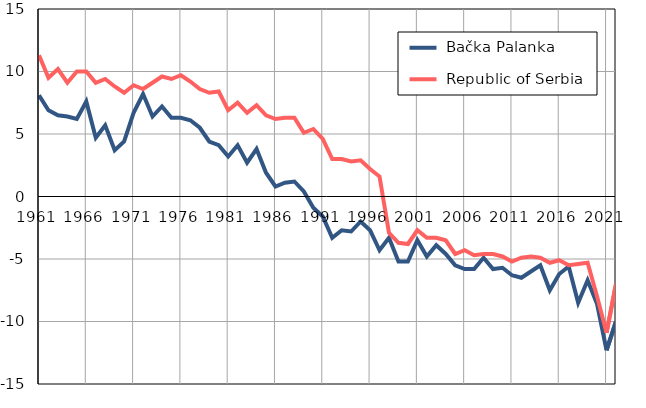
| Category |  Bačka Palanka |  Republic of Serbia |
|---|---|---|
| 1961.0 | 8.1 | 11.3 |
| 1962.0 | 6.9 | 9.5 |
| 1963.0 | 6.5 | 10.2 |
| 1964.0 | 6.4 | 9.1 |
| 1965.0 | 6.2 | 10 |
| 1966.0 | 7.6 | 10 |
| 1967.0 | 4.7 | 9.1 |
| 1968.0 | 5.7 | 9.4 |
| 1969.0 | 3.7 | 8.8 |
| 1970.0 | 4.4 | 8.3 |
| 1971.0 | 6.7 | 8.9 |
| 1972.0 | 8.2 | 8.6 |
| 1973.0 | 6.4 | 9.1 |
| 1974.0 | 7.2 | 9.6 |
| 1975.0 | 6.3 | 9.4 |
| 1976.0 | 6.3 | 9.7 |
| 1977.0 | 6.1 | 9.2 |
| 1978.0 | 5.5 | 8.6 |
| 1979.0 | 4.4 | 8.3 |
| 1980.0 | 4.1 | 8.4 |
| 1981.0 | 3.2 | 6.9 |
| 1982.0 | 4.1 | 7.5 |
| 1983.0 | 2.7 | 6.7 |
| 1984.0 | 3.8 | 7.3 |
| 1985.0 | 1.9 | 6.5 |
| 1986.0 | 0.8 | 6.2 |
| 1987.0 | 1.1 | 6.3 |
| 1988.0 | 1.2 | 6.3 |
| 1989.0 | 0.4 | 5.1 |
| 1990.0 | -0.9 | 5.4 |
| 1991.0 | -1.6 | 4.6 |
| 1992.0 | -3.3 | 3 |
| 1993.0 | -2.7 | 3 |
| 1994.0 | -2.8 | 2.8 |
| 1995.0 | -2 | 2.9 |
| 1996.0 | -2.7 | 2.2 |
| 1997.0 | -4.3 | 1.6 |
| 1998.0 | -3.3 | -2.9 |
| 1999.0 | -5.2 | -3.7 |
| 2000.0 | -5.2 | -3.8 |
| 2001.0 | -3.5 | -2.7 |
| 2002.0 | -4.8 | -3.3 |
| 2003.0 | -3.9 | -3.3 |
| 2004.0 | -4.6 | -3.5 |
| 2005.0 | -5.5 | -4.6 |
| 2006.0 | -5.8 | -4.3 |
| 2007.0 | -5.8 | -4.7 |
| 2008.0 | -4.9 | -4.6 |
| 2009.0 | -5.8 | -4.6 |
| 2010.0 | -5.7 | -4.8 |
| 2011.0 | -6.3 | -5.2 |
| 2012.0 | -6.5 | -4.9 |
| 2013.0 | -6 | -4.8 |
| 2014.0 | -5.5 | -4.9 |
| 2015.0 | -7.5 | -5.3 |
| 2016.0 | -6.2 | -5.1 |
| 2017.0 | -5.6 | -5.5 |
| 2018.0 | -8.5 | -5.4 |
| 2019.0 | -6.7 | -5.3 |
| 2020.0 | -8.6 | -8 |
| 2021.0 | -12.3 | -10.9 |
| 2022.0 | -10 | -7 |